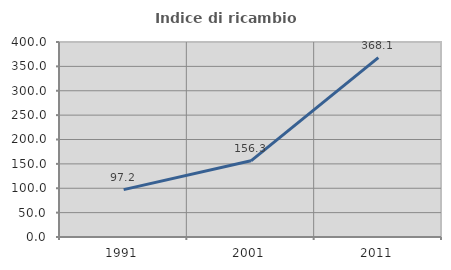
| Category | Indice di ricambio occupazionale  |
|---|---|
| 1991.0 | 97.225 |
| 2001.0 | 156.275 |
| 2011.0 | 368.098 |